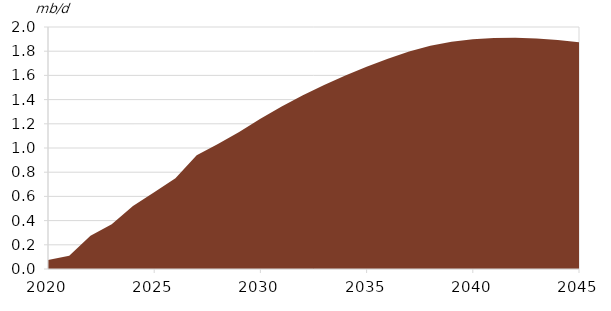
| Category | Crude |
|---|---|
| 2020-01-01 | 0.073 |
| 2021-01-01 | 0.109 |
| 2022-01-01 | 0.276 |
| 2023-01-01 | 0.37 |
| 2024-01-01 | 0.52 |
| 2025-01-01 | 0.635 |
| 2026-01-01 | 0.751 |
| 2027-01-01 | 0.941 |
| 2028-01-01 | 1.032 |
| 2029-01-01 | 1.133 |
| 2030-01-01 | 1.242 |
| 2031-01-01 | 1.343 |
| 2032-01-01 | 1.435 |
| 2033-01-01 | 1.521 |
| 2034-01-01 | 1.599 |
| 2035-01-01 | 1.671 |
| 2036-01-01 | 1.737 |
| 2037-01-01 | 1.798 |
| 2038-01-01 | 1.844 |
| 2039-01-01 | 1.877 |
| 2040-01-01 | 1.899 |
| 2041-01-01 | 1.91 |
| 2042-01-01 | 1.912 |
| 2043-01-01 | 1.906 |
| 2044-01-01 | 1.893 |
| 2045-01-01 | 1.874 |